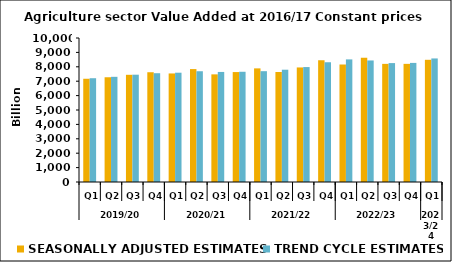
| Category | SEASONALLY ADJUSTED ESTIMATES | TREND CYCLE ESTIMATES |
|---|---|---|
| 0 | 7169.299 | 7206.953 |
| 1 | 7273.877 | 7304.151 |
| 2 | 7443.834 | 7451.502 |
| 3 | 7622.52 | 7554.845 |
| 4 | 7537.753 | 7589.876 |
| 5 | 7841.05 | 7691.797 |
| 6 | 7474.913 | 7642.504 |
| 7 | 7634.246 | 7654.564 |
| 8 | 7890.256 | 7695.627 |
| 9 | 7640.104 | 7798.167 |
| 10 | 7954.79 | 7981.422 |
| 11 | 8454.756 | 8315.978 |
| 12 | 8159.111 | 8514.106 |
| 13 | 8628.597 | 8440.152 |
| 14 | 8203.298 | 8257.795 |
| 15 | 8203.99 | 8270.096 |
| 16 | 8486.275 | 8580.072 |